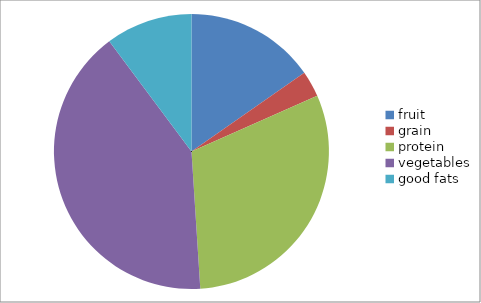
| Category | Series 0 |
|---|---|
| fruit | 15 |
| grain | 3 |
| protein | 30 |
| vegetables | 40 |
| good fats | 10 |